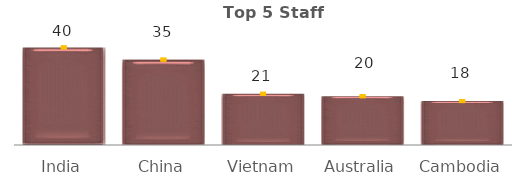
| Category | Series 0 |
|---|---|
| India | 40 |
| China | 35 |
| Vietnam | 21 |
| Australia | 20 |
| Cambodia | 18 |